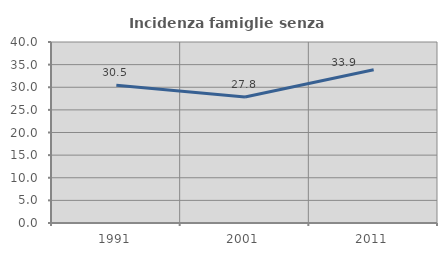
| Category | Incidenza famiglie senza nuclei |
|---|---|
| 1991.0 | 30.45 |
| 2001.0 | 27.828 |
| 2011.0 | 33.86 |